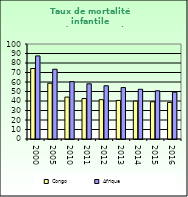
| Category | Congo | Afrique                        |
|---|---|---|
| 2000.0 | 74.2 | 87.462 |
| 2005.0 | 58.7 | 73.418 |
| 2010.0 | 44.1 | 60.345 |
| 2011.0 | 42.6 | 58.107 |
| 2012.0 | 41.4 | 56.032 |
| 2013.0 | 40.6 | 54.131 |
| 2014.0 | 39.9 | 52.336 |
| 2015.0 | 39.2 | 50.754 |
| 2016.0 | 38.5 | 49.283 |